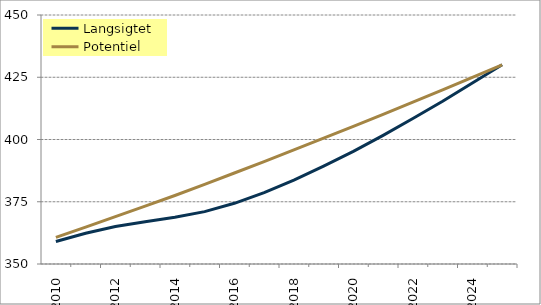
| Category | Langsigtet | Potentiel |
|---|---|---|
| 2010-01-01 | 359.015 | 360.667 |
| 2011-01-01 | 362.364 | 364.826 |
| 2012-01-01 | 365.07 | 369.006 |
| 2013-01-01 | 366.952 | 373.225 |
| 2014-01-01 | 368.793 | 377.502 |
| 2015-01-01 | 371.02 | 381.996 |
| 2016-01-01 | 374.372 | 386.544 |
| 2017-01-01 | 378.694 | 391.146 |
| 2018-01-01 | 383.701 | 395.803 |
| 2019-01-01 | 389.299 | 400.515 |
| 2020-01-01 | 395.216 | 405.283 |
| 2021-01-01 | 401.669 | 410.108 |
| 2022-01-01 | 408.407 | 414.991 |
| 2023-01-01 | 415.353 | 419.931 |
| 2024-01-01 | 422.689 | 424.931 |
| 2025-01-01 | 430.034 | 429.99 |